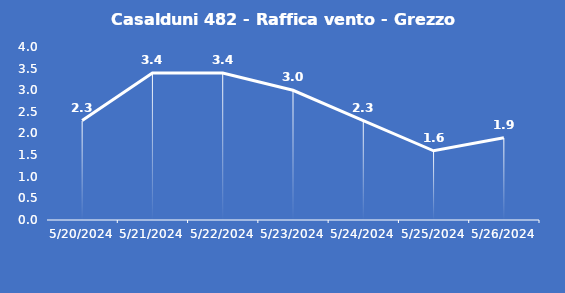
| Category | Casalduni 482 - Raffica vento - Grezzo (m/s) |
|---|---|
| 5/20/24 | 2.3 |
| 5/21/24 | 3.4 |
| 5/22/24 | 3.4 |
| 5/23/24 | 3 |
| 5/24/24 | 2.3 |
| 5/25/24 | 1.6 |
| 5/26/24 | 1.9 |